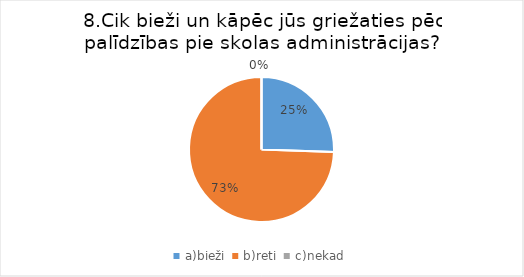
| Category | Series 0 |
|---|---|
| a)bieži  | 0.25 |
| b)reti  | 0.729 |
| c)nekad | 0 |